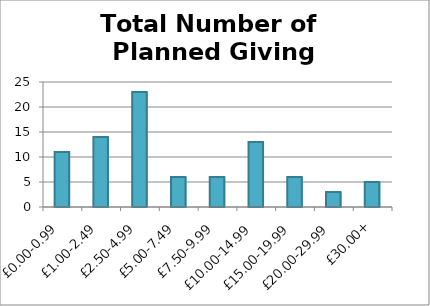
| Category | All Plnd Gvng |
|---|---|
| £0.00-0.99 | 11 |
| £1.00-2.49 | 14 |
| £2.50-4.99 | 23 |
| £5.00-7.49 | 6 |
| £7.50-9.99 | 6 |
| £10.00-14.99 | 13 |
| £15.00-19.99 | 6 |
| £20.00-29.99 | 3 |
| £30.00+ | 5 |